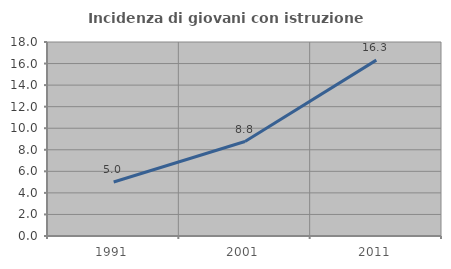
| Category | Incidenza di giovani con istruzione universitaria |
|---|---|
| 1991.0 | 5.01 |
| 2001.0 | 8.763 |
| 2011.0 | 16.319 |